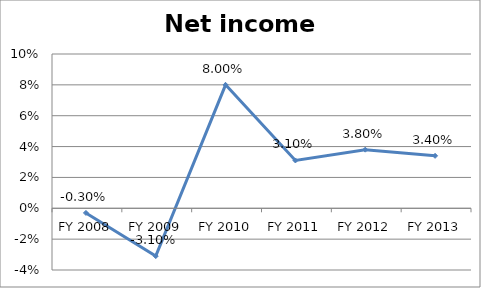
| Category | Net income ratio |
|---|---|
| FY 2013 | 0.034 |
| FY 2012 | 0.038 |
| FY 2011 | 0.031 |
| FY 2010 | 0.08 |
| FY 2009 | -0.031 |
| FY 2008 | -0.003 |